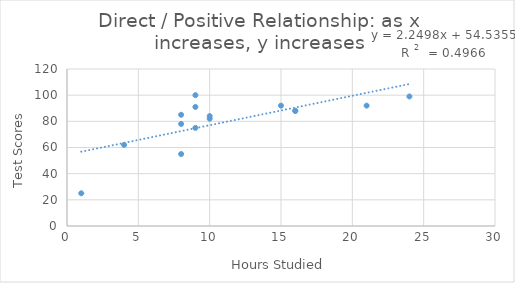
| Category | Test Scores |
|---|---|
| 8.0 | 85 |
| 24.0 | 99 |
| 4.0 | 62 |
| 21.0 | 92 |
| 9.0 | 100 |
| 16.0 | 88 |
| 9.0 | 75 |
| 16.0 | 88 |
| 1.0 | 25 |
| 8.0 | 78 |
| 10.0 | 82 |
| 15.0 | 92 |
| 8.0 | 55 |
| 10.0 | 84 |
| 9.0 | 91 |